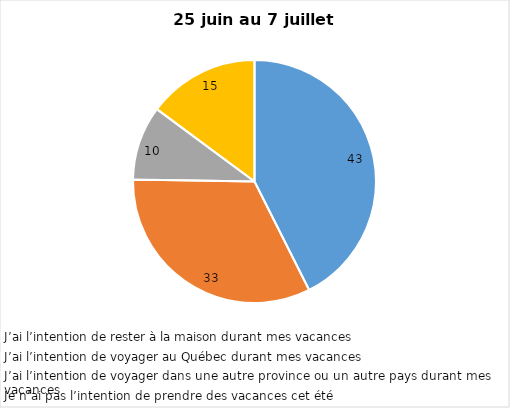
| Category | Series 0 |
|---|---|
| J’ai l’intention de rester à la maison durant mes vacances | 43 |
| J’ai l’intention de voyager au Québec durant mes vacances | 33 |
| J’ai l’intention de voyager dans une autre province ou un autre pays durant mes vacances | 10 |
| Je n’ai pas l’intention de prendre des vacances cet été | 15 |